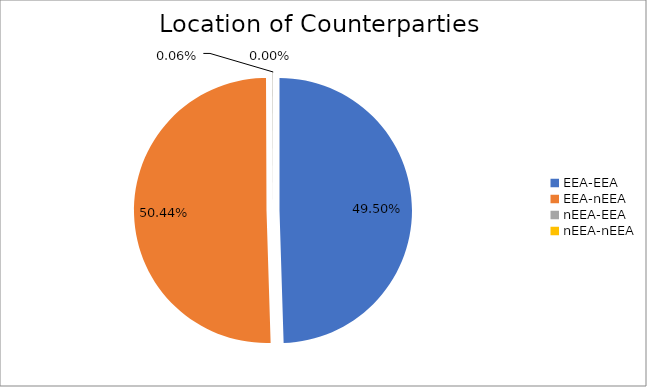
| Category | Series 0 |
|---|---|
| EEA-EEA | 6311630.612 |
| EEA-nEEA | 6430672.877 |
| nEEA-EEA | 7070.607 |
| nEEA-nEEA | 508.523 |